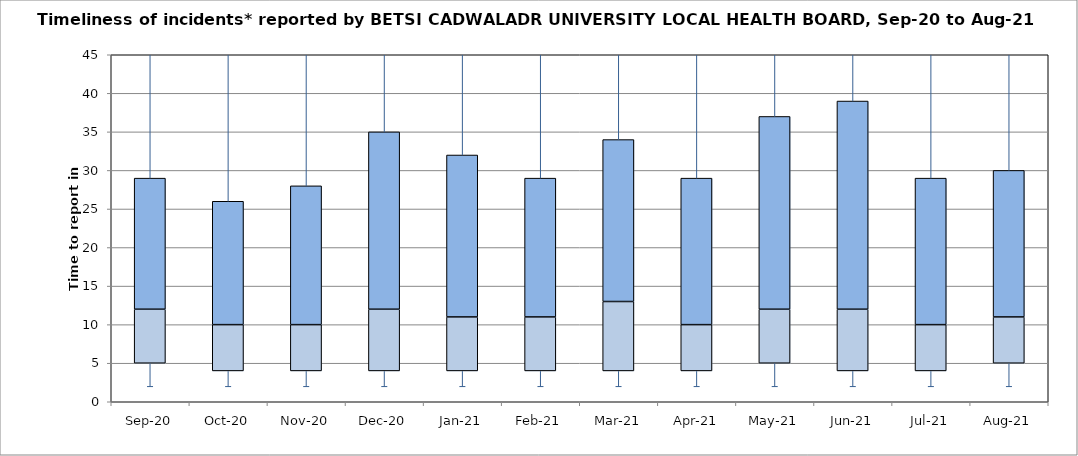
| Category | Series 0 | Series 1 | Series 2 |
|---|---|---|---|
| Sep-20 | 5 | 7 | 17 |
| Oct-20 | 4 | 6 | 16 |
| Nov-20 | 4 | 6 | 18 |
| Dec-20 | 4 | 8 | 23 |
| Jan-21 | 4 | 7 | 21 |
| Feb-21 | 4 | 7 | 18 |
| Mar-21 | 4 | 9 | 21 |
| Apr-21 | 4 | 6 | 19 |
| May-21 | 5 | 7 | 25 |
| Jun-21 | 4 | 8 | 27 |
| Jul-21 | 4 | 6 | 19 |
| Aug-21 | 5 | 6 | 19 |